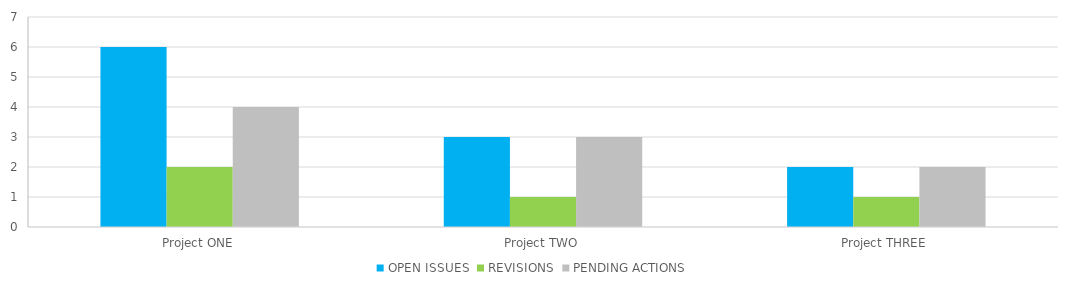
| Category | OPEN ISSUES | REVISIONS | PENDING ACTIONS |
|---|---|---|---|
| Project ONE | 6 | 2 | 4 |
| Project TWO | 3 | 1 | 3 |
| Project THREE | 2 | 1 | 2 |